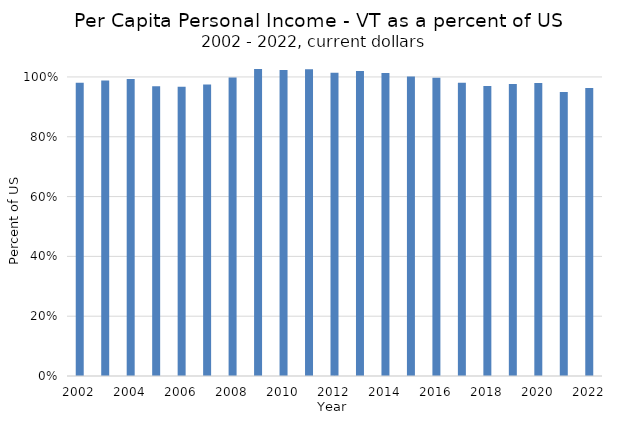
| Category | Vermont |
|---|---|
| 2022 | 0.963 |
| 2021 | 0.95 |
| 2020 | 0.98 |
| 2019 | 0.977 |
| 2018 | 0.97 |
| 2017 | 0.981 |
| 2016 | 0.997 |
| 2015 | 1.001 |
| 2014 | 1.013 |
| 2013 | 1.02 |
| 2012 | 1.014 |
| 2011 | 1.026 |
| 2010 | 1.023 |
| 2009 | 1.027 |
| 2008 | 0.998 |
| 2007 | 0.975 |
| 2006 | 0.967 |
| 2005 | 0.969 |
| 2004 | 0.993 |
| 2003 | 0.988 |
| 2002 | 0.981 |